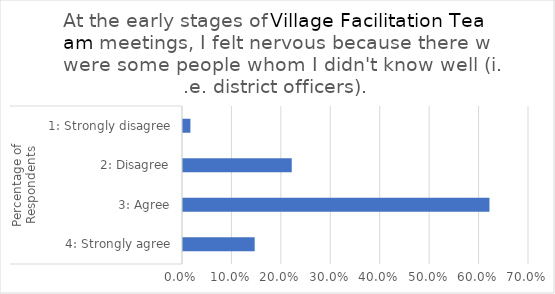
| Category | At the early stages of the Village Facilitation Team meetings, I felt nervous because there were some people whom I didn't know well (i.e. district officers).  |
|---|---|
| 0 | 0.145 |
| 1 | 0.62 |
| 2 | 0.22 |
| 3 | 0.015 |